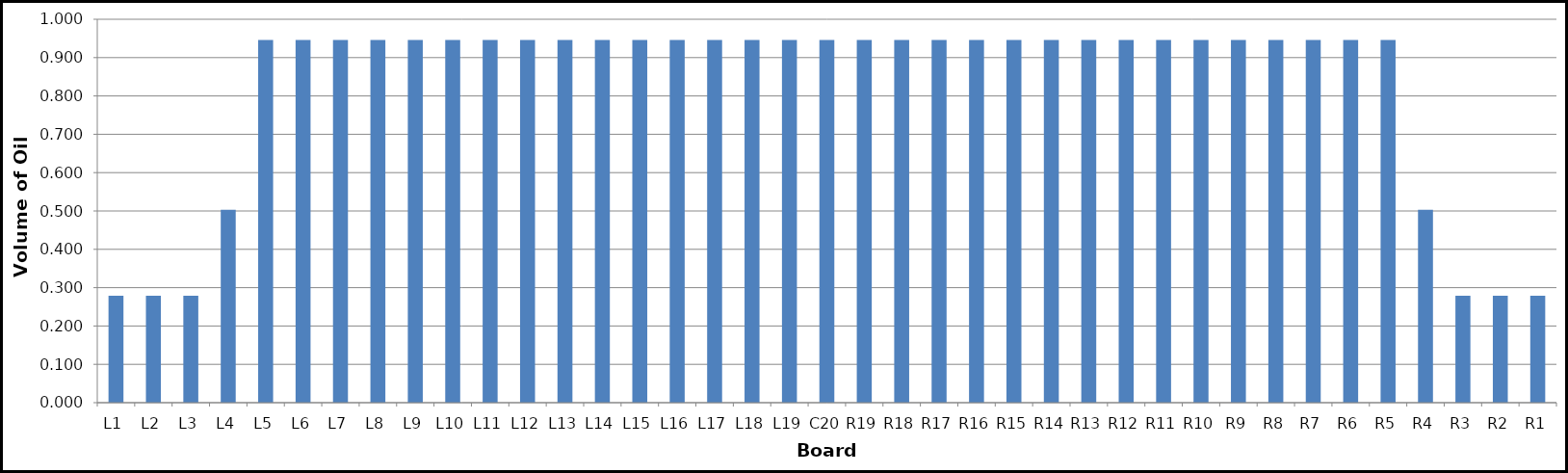
| Category | Series 0 |
|---|---|
| L1 | 0.279 |
| L2 | 0.279 |
| L3 | 0.279 |
| L4 | 0.503 |
| L5 | 0.946 |
| L6 | 0.946 |
| L7 | 0.946 |
| L8 | 0.946 |
| L9 | 0.946 |
| L10 | 0.946 |
| L11 | 0.946 |
| L12 | 0.946 |
| L13 | 0.946 |
| L14 | 0.946 |
| L15 | 0.946 |
| L16 | 0.946 |
| L17 | 0.946 |
| L18 | 0.946 |
| L19 | 0.946 |
| C20 | 0.946 |
| R19 | 0.946 |
| R18 | 0.946 |
| R17 | 0.946 |
| R16 | 0.946 |
| R15 | 0.946 |
| R14 | 0.946 |
| R13 | 0.946 |
| R12 | 0.946 |
| R11 | 0.946 |
| R10 | 0.946 |
| R9 | 0.946 |
| R8 | 0.946 |
| R7 | 0.946 |
| R6 | 0.946 |
| R5 | 0.946 |
| R4 | 0.503 |
| R3 | 0.279 |
| R2 | 0.279 |
| R1 | 0.279 |